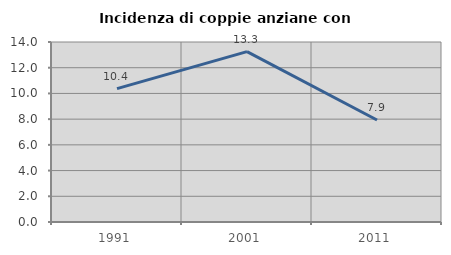
| Category | Incidenza di coppie anziane con figli |
|---|---|
| 1991.0 | 10.377 |
| 2001.0 | 13.253 |
| 2011.0 | 7.937 |